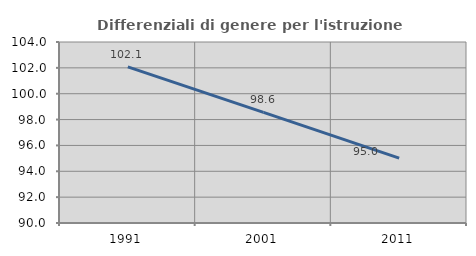
| Category | Differenziali di genere per l'istruzione superiore |
|---|---|
| 1991.0 | 102.073 |
| 2001.0 | 98.562 |
| 2011.0 | 95.019 |